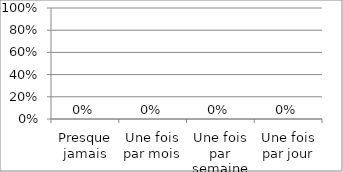
| Category | Series 0 |
|---|---|
| Presque jamais | 0 |
| Une fois par mois | 0 |
| Une fois par semaine | 0 |
| Une fois par jour | 0 |